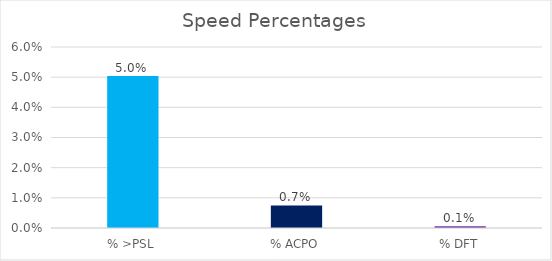
| Category | Series 0 |
|---|---|
| % >PSL | 0.05 |
| % ACPO | 0.007 |
| % DFT | 0.001 |